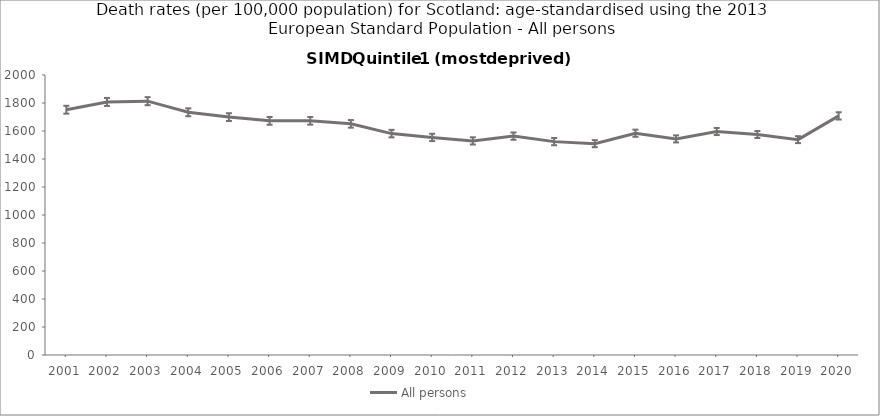
| Category | All persons |
|---|---|
| 2001.0 | 1752.1 |
| 2002.0 | 1807.6 |
| 2003.0 | 1813.1 |
| 2004.0 | 1733.6 |
| 2005.0 | 1699.2 |
| 2006.0 | 1672.4 |
| 2007.0 | 1672.8 |
| 2008.0 | 1651 |
| 2009.0 | 1581.4 |
| 2010.0 | 1554.2 |
| 2011.0 | 1529.3 |
| 2012.0 | 1563.5 |
| 2013.0 | 1524.1 |
| 2014.0 | 1509.6 |
| 2015.0 | 1584.1 |
| 2016.0 | 1543.6 |
| 2017.0 | 1596.4 |
| 2018.0 | 1575.1 |
| 2019.0 | 1538.3 |
| 2020.0 | 1707.9 |